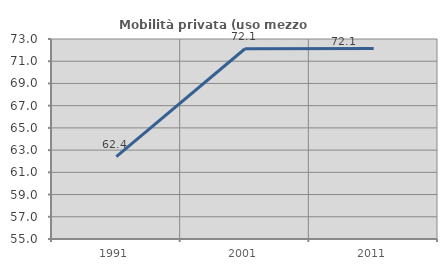
| Category | Mobilità privata (uso mezzo privato) |
|---|---|
| 1991.0 | 62.415 |
| 2001.0 | 72.123 |
| 2011.0 | 72.136 |